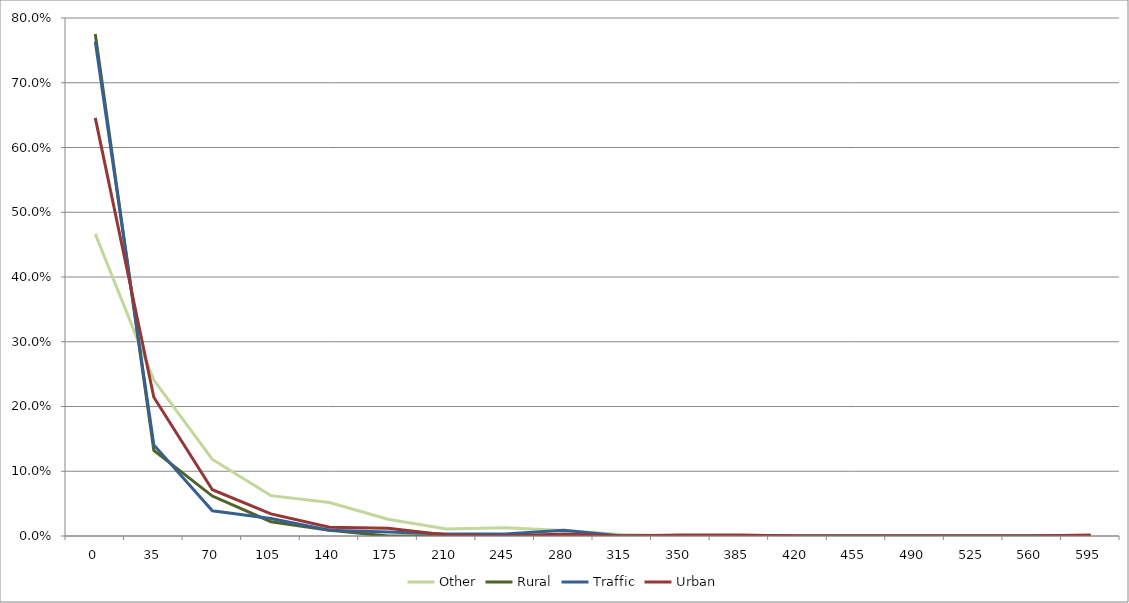
| Category | Other | Rural | Traffic | Urban |
|---|---|---|---|---|
| 0.0 | 0.467 | 0.775 | 0.763 | 0.646 |
| 35.0 | 0.241 | 0.132 | 0.141 | 0.214 |
| 70.0 | 0.118 | 0.062 | 0.039 | 0.071 |
| 105.0 | 0.062 | 0.022 | 0.027 | 0.034 |
| 140.0 | 0.052 | 0.009 | 0.009 | 0.013 |
| 175.0 | 0.026 | 0 | 0.006 | 0.012 |
| 210.0 | 0.011 | 0 | 0.003 | 0.001 |
| 245.0 | 0.013 | 0 | 0.003 | 0 |
| 280.0 | 0.009 | 0 | 0.009 | 0.003 |
| 315.0 | 0.002 | 0 | 0 | 0 |
| 350.0 | 0 | 0 | 0 | 0.001 |
| 385.0 | 0 | 0 | 0 | 0.001 |
| 420.0 | 0 | 0 | 0 | 0 |
| 455.0 | 0 | 0 | 0 | 0 |
| 490.0 | 0 | 0 | 0 | 0 |
| 525.0 | 0 | 0 | 0 | 0 |
| 560.0 | 0 | 0 | 0 | 0 |
| 595.0 | 0 | 0 | 0 | 0.001 |